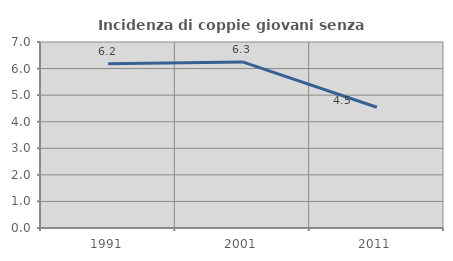
| Category | Incidenza di coppie giovani senza figli |
|---|---|
| 1991.0 | 6.186 |
| 2001.0 | 6.25 |
| 2011.0 | 4.545 |